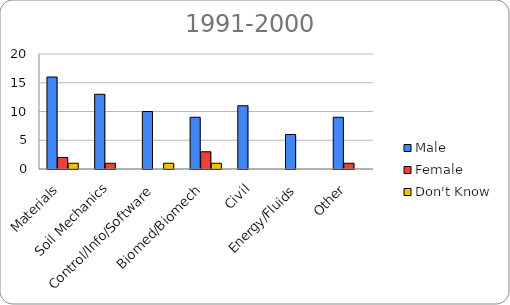
| Category | Male | Female | Don't Know |
|---|---|---|---|
| Materials | 16 | 2 | 1 |
| Soil Mechanics | 13 | 1 | 0 |
| Control/Info/Software | 10 | 0 | 1 |
| Biomed/Biomech | 9 | 3 | 1 |
| Civil | 11 | 0 | 0 |
| Energy/Fluids | 6 | 0 | 0 |
| Other | 9 | 1 | 0 |